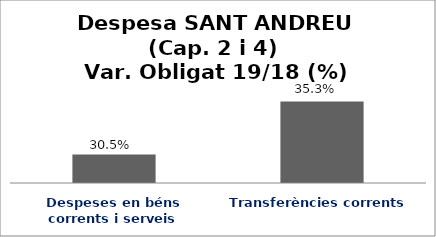
| Category | Series 0 |
|---|---|
| Despeses en béns corrents i serveis | 0.305 |
| Transferències corrents | 0.353 |